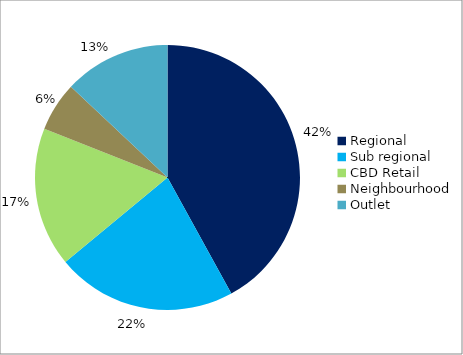
| Category | Series 0 |
|---|---|
| Regional | 0.42 |
| Sub regional | 0.22 |
| CBD Retail | 0.17 |
| Neighbourhood | 0.06 |
| Outlet | 0.13 |